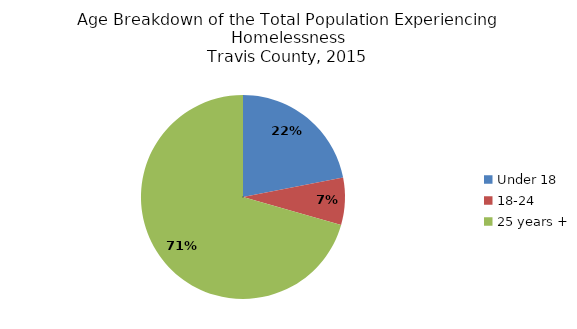
| Category | Percent of Total |
|---|---|
| Under 18 | 0.219 |
| 18-24 | 0.075 |
| 25 years + | 0.706 |